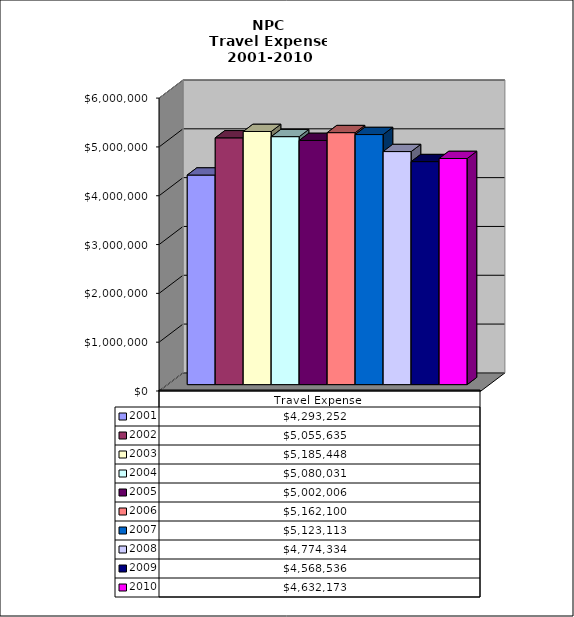
| Category | 2001 | 2002 | 2003 | 2004 | 2005 | 2006 | 2007 | 2008 | 2009 | 2010 |
|---|---|---|---|---|---|---|---|---|---|---|
| Travel Expense | 4293252 | 5055635 | 5185448 | 5080031 | 5002006 | 5162100 | 5123113 | 4774334 | 4568536 | 4632173 |